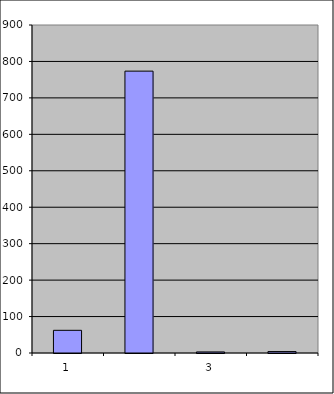
| Category | Series 0 |
|---|---|
| 0 | 62.25 |
| 1 | 773.437 |
| 2 | 2.925 |
| 3 | 3.928 |